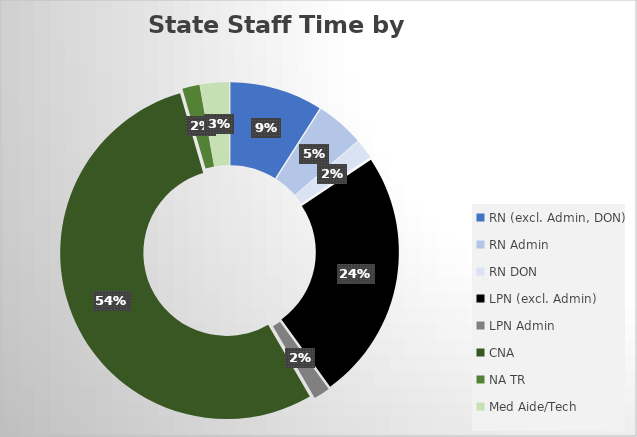
| Category | Series 0 |
|---|---|
| RN (excl. Admin, DON) | 9850.502 |
| RN Admin | 5111.482 |
| RN DON | 2086.027 |
| LPN (excl. Admin) | 26652.132 |
| LPN Admin | 1739.25 |
| CNA | 58789.439 |
| NA TR | 1832.813 |
| Med Aide/Tech | 3082.073 |